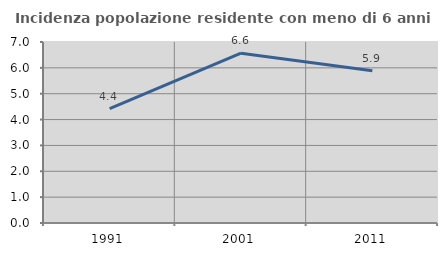
| Category | Incidenza popolazione residente con meno di 6 anni |
|---|---|
| 1991.0 | 4.422 |
| 2001.0 | 6.567 |
| 2011.0 | 5.89 |